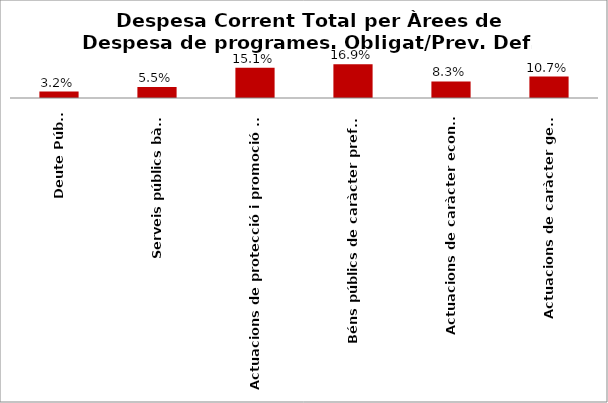
| Category | Series 0 |
|---|---|
| Deute Públic | 0.032 |
| Serveis públics bàsics | 0.055 |
| Actuacions de protecció i promoció social | 0.151 |
| Béns públics de caràcter preferent | 0.169 |
| Actuacions de caràcter econòmic | 0.083 |
| Actuacions de caràcter general | 0.107 |